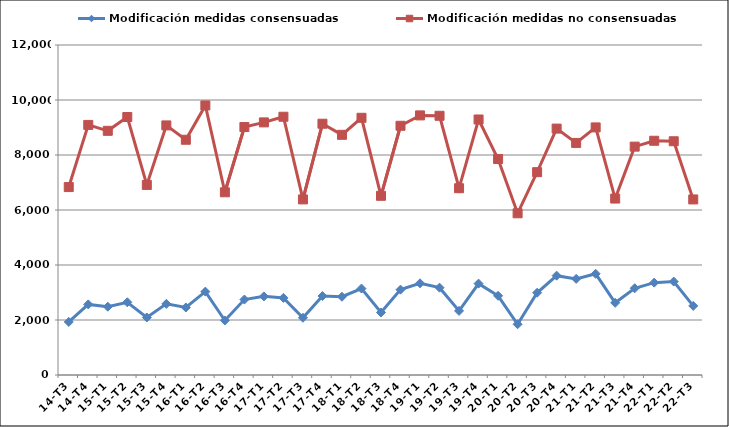
| Category | Modificación medidas consensuadas | Modificación medidas no consensuadas |
|---|---|---|
| 14-T3 | 1929 | 6834 |
| 14-T4 | 2567 | 9094 |
| 15-T1 | 2483 | 8879 |
| 15-T2 | 2644 | 9382 |
| 15-T3 | 2092 | 6911 |
| 15-T4 | 2586 | 9076 |
| 16-T1 | 2455 | 8554 |
| 16-T2 | 3032 | 9802 |
| 16-T3 | 1983 | 6644 |
| 16-T4 | 2744 | 9017 |
| 17-T1 | 2859 | 9186 |
| 17-T2 | 2804 | 9391 |
| 17-T3 | 2082 | 6385 |
| 17-T4 | 2872 | 9137 |
| 18-T1 | 2846 | 8734 |
| 18-T2 | 3144 | 9353 |
| 18-T3 | 2272 | 6516 |
| 18-T4 | 3104 | 9063 |
| 19-T1 | 3335 | 9440 |
| 19-T2 | 3176 | 9426 |
| 19-T3 | 2332 | 6792 |
| 19-T4 | 3323 | 9291 |
| 20-T1 | 2880 | 7854 |
| 20-T2 | 1846 | 5880 |
| 20-T3 | 2991 | 7376 |
| 20-T4 | 3612 | 8960 |
| 21-T1 | 3496 | 8439 |
| 21-T2 | 3680 | 9003 |
| 21-T3 | 2625 | 6416 |
| 21-T4 | 3154 | 8304 |
| 22-T1 | 3359 | 8518 |
| 22-T2 | 3398 | 8500 |
| 22-T3 | 2512 | 6384 |